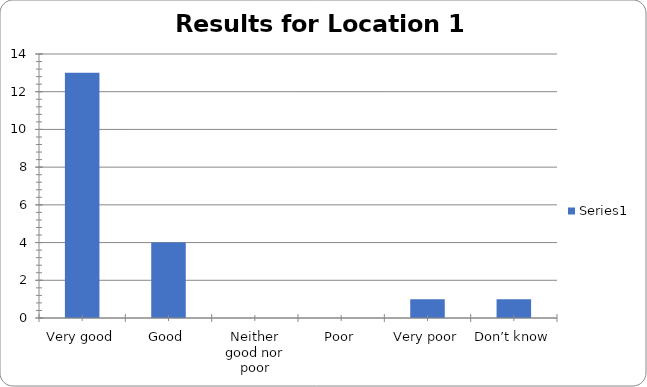
| Category | Series 0 |
|---|---|
| Very good | 13 |
| Good | 4 |
| Neither good nor poor | 0 |
| Poor | 0 |
| Very poor | 1 |
| Don’t know | 1 |